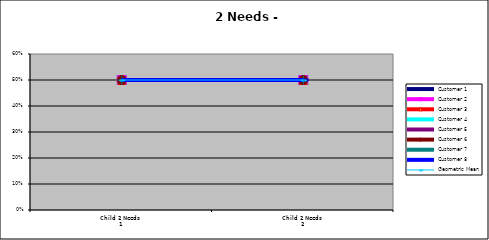
| Category | Customer 1 | Customer 2 | Customer 3 | Customer 4 | Customer 5 | Customer 6 | Customer 7 | Customer 8 | Geometric Mean |
|---|---|---|---|---|---|---|---|---|---|
| Child 2 Needs 1 | 0.5 | 0.5 | 0.5 | 0.5 | 0.5 | 0.5 | 0.5 | 0.5 | 0.5 |
| Child 2 Needs 2 | 0.5 | 0.5 | 0.5 | 0.5 | 0.5 | 0.5 | 0.5 | 0.5 | 0.5 |